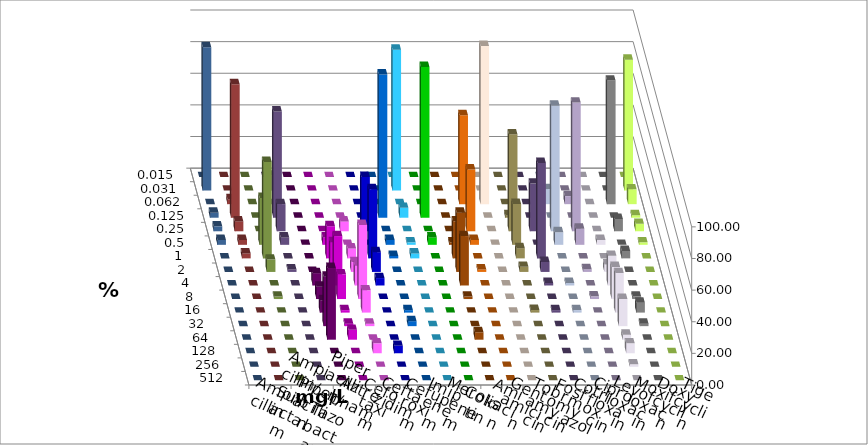
| Category | Ampicillin | Ampicillin/ Sulbactam | Piperacillin | Piperacillin/ Tazobactam | Aztreonam | Cefotaxim | Ceftazidim | Cefuroxim | Imipenem | Meropenem | Colistin | Amikacin | Gentamicin | Tobramycin | Fosfomycin | Cotrimoxazol | Ciprofloxacin | Levofloxacin | Moxifloxacin | Doxycyclin | Tigecyclin |
|---|---|---|---|---|---|---|---|---|---|---|---|---|---|---|---|---|---|---|---|---|---|
| 0.015 | 0 | 0 | 0 | 0 | 0 | 0 | 0 | 0 | 0 | 0 | 0 | 0 | 0 | 0 | 0 | 0 | 0 | 0 | 0 | 0 | 0 |
| 0.031 | 0 | 0 | 0 | 0 | 0 | 89.062 | 0 | 0 | 0 | 0 | 0 | 0 | 0 | 0 | 0 | 0 | 82.812 | 90.625 | 0 | 0 | 9.375 |
| 0.062 | 0 | 0 | 0 | 0 | 0 | 0 | 0 | 0 | 56.25 | 100 | 0 | 0 | 9.524 | 5.085 | 0 | 78.125 | 9.375 | 0 | 3.125 | 0 | 0 |
| 0.125 | 0 | 0 | 0 | 0 | 90.625 | 6.25 | 95.312 | 0 | 0 | 0 | 1.613 | 0 | 0 | 0 | 0 | 0 | 1.562 | 3.125 | 84.375 | 0 | 67.188 |
| 0.25 | 0 | 0 | 6.25 | 34.375 | 0 | 0 | 0 | 0 | 39.062 | 0 | 61.29 | 30.159 | 79.365 | 81.356 | 0 | 7.812 | 4.688 | 3.125 | 6.25 | 0 | 17.188 |
| 0.5 | 0 | 4.688 | 0 | 0 | 3.125 | 1.562 | 4.688 | 1.562 | 3.125 | 0 | 25.806 | 0 | 7.937 | 10.169 | 3.125 | 0 | 1.562 | 3.125 | 3.125 | 29.688 | 4.688 |
| 1.0 | 0 | 20.312 | 6.25 | 43.75 | 1.562 | 3.125 | 0 | 23.438 | 0 | 0 | 6.452 | 60.317 | 0 | 0 | 0 | 4.688 | 0 | 0 | 3.125 | 60.938 | 0 |
| 2.0 | 0 | 18.75 | 6.25 | 12.5 | 0 | 0 | 0 | 37.5 | 1.562 | 0 | 3.226 | 6.349 | 0 | 1.695 | 4.688 | 0 | 0 | 0 | 0 | 7.812 | 1.562 |
| 4.0 | 7.812 | 31.25 | 12.5 | 4.688 | 0 | 0 | 0 | 31.25 | 0 | 0 | 0 | 1.587 | 1.587 | 0 | 18.75 | 0 | 0 | 0 | 0 | 0 | 0 |
| 8.0 | 7.812 | 15.625 | 46.875 | 0 | 0 | 0 | 0 | 1.562 | 0 | 0 | 0 | 0 | 0 | 1.695 | 20.312 | 1.562 | 0 | 0 | 0 | 1.562 | 0 |
| 16.0 | 7.812 | 1.562 | 14.062 | 0 | 1.562 | 0 | 0 | 0 | 0 | 0 | 1.613 | 1.587 | 1.587 | 0 | 25 | 6.25 | 0 | 0 | 0 | 0 | 0 |
| 32.0 | 31.25 | 1.562 | 1.562 | 0 | 3.125 | 0 | 0 | 0 | 0 | 0 | 0 | 0 | 0 | 0 | 17.188 | 1.562 | 0 | 0 | 0 | 0 | 0 |
| 64.0 | 45.312 | 6.25 | 0 | 0 | 0 | 0 | 0 | 4.688 | 0 | 0 | 0 | 0 | 0 | 0 | 3.125 | 0 | 0 | 0 | 0 | 0 | 0 |
| 128.0 | 0 | 0 | 6.25 | 4.688 | 0 | 0 | 0 | 0 | 0 | 0 | 0 | 0 | 0 | 0 | 6.25 | 0 | 0 | 0 | 0 | 0 | 0 |
| 256.0 | 0 | 0 | 0 | 0 | 0 | 0 | 0 | 0 | 0 | 0 | 0 | 0 | 0 | 0 | 1.562 | 0 | 0 | 0 | 0 | 0 | 0 |
| 512.0 | 0 | 0 | 0 | 0 | 0 | 0 | 0 | 0 | 0 | 0 | 0 | 0 | 0 | 0 | 0 | 0 | 0 | 0 | 0 | 0 | 0 |